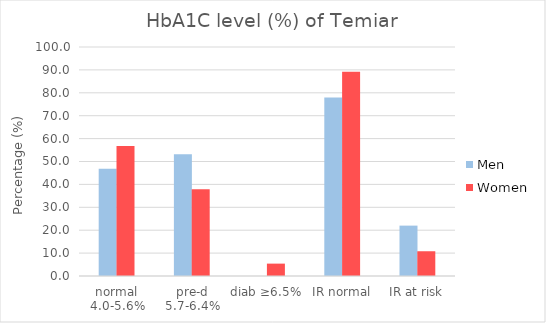
| Category | Men | Women |
|---|---|---|
| normal 4.0-5.6% | 46.875 | 56.757 |
| pre-d 5.7-6.4% | 53.125 | 37.838 |
| diab ≥6.5% | 0 | 5.405 |
| IR normal | 78 | 89.189 |
| IR at risk | 22 | 10.811 |